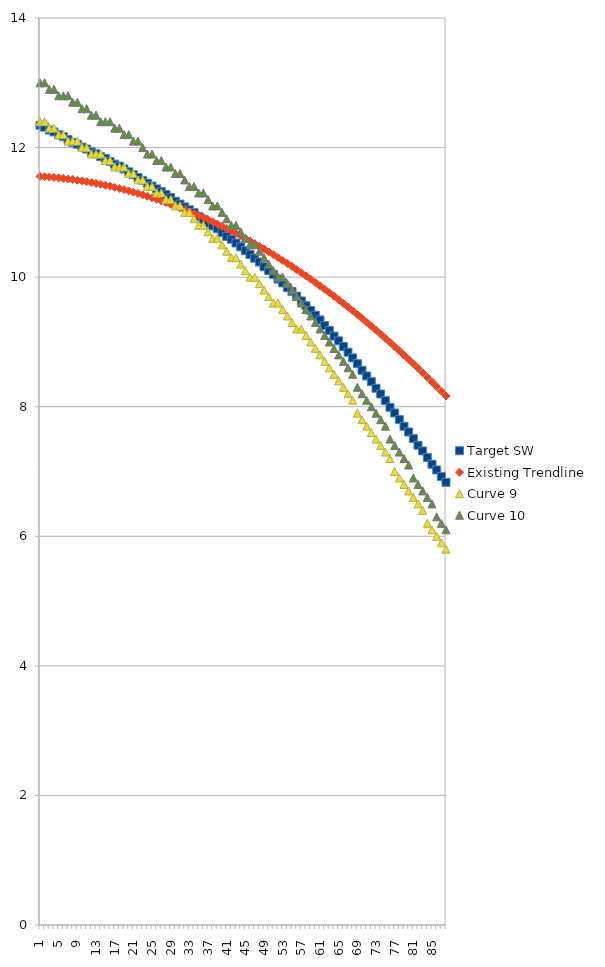
| Category | Target SW | Existing Trendline | Curve 9 | Curve 10 |
|---|---|---|---|---|
| 1 | 12.344 | 11.555 | 12.4 | 13 |
| 2 | 12.315 | 11.551 | 12.4 | 13 |
| 3 | 12.271 | 11.545 | 12.3 | 12.9 |
| 4 | 12.241 | 11.539 | 12.3 | 12.9 |
| 5 | 12.197 | 11.532 | 12.2 | 12.8 |
| 6 | 12.168 | 11.524 | 12.2 | 12.8 |
| 7 | 12.124 | 11.516 | 12.1 | 12.8 |
| 8 | 12.08 | 11.507 | 12.1 | 12.7 |
| 9 | 12.051 | 11.496 | 12.1 | 12.7 |
| 10 | 12.007 | 11.485 | 12 | 12.6 |
| 11 | 11.978 | 11.474 | 12 | 12.6 |
| 12 | 11.934 | 11.461 | 11.9 | 12.5 |
| 13 | 11.904 | 11.448 | 11.9 | 12.5 |
| 14 | 11.86 | 11.434 | 11.9 | 12.4 |
| 15 | 11.831 | 11.419 | 11.8 | 12.4 |
| 16 | 11.787 | 11.403 | 11.8 | 12.4 |
| 17 | 11.743 | 11.386 | 11.7 | 12.3 |
| 18 | 11.714 | 11.369 | 11.7 | 12.3 |
| 19 | 11.67 | 11.351 | 11.7 | 12.2 |
| 20 | 11.626 | 11.332 | 11.6 | 12.2 |
| 21 | 11.582 | 11.312 | 11.6 | 12.1 |
| 22 | 11.538 | 11.292 | 11.5 | 12.1 |
| 23 | 11.494 | 11.27 | 11.5 | 12 |
| 24 | 11.45 | 11.248 | 11.4 | 11.9 |
| 25 | 11.406 | 11.225 | 11.4 | 11.9 |
| 26 | 11.362 | 11.201 | 11.3 | 11.8 |
| 27 | 11.318 | 11.177 | 11.3 | 11.8 |
| 28 | 11.274 | 11.151 | 11.2 | 11.7 |
| 29 | 11.23 | 11.125 | 11.2 | 11.7 |
| 30 | 11.172 | 11.098 | 11.1 | 11.6 |
| 31 | 11.128 | 11.071 | 11.1 | 11.6 |
| 32 | 11.084 | 11.042 | 11 | 11.5 |
| 33 | 11.04 | 11.013 | 11 | 11.4 |
| 34 | 10.996 | 10.983 | 10.9 | 11.4 |
| 35 | 10.937 | 10.952 | 10.8 | 11.3 |
| 36 | 10.893 | 10.92 | 10.8 | 11.3 |
| 37 | 10.834 | 10.887 | 10.7 | 11.2 |
| 38 | 10.791 | 10.854 | 10.6 | 11.1 |
| 39 | 10.747 | 10.82 | 10.6 | 11.1 |
| 40 | 10.688 | 10.785 | 10.5 | 11 |
| 41 | 10.629 | 10.749 | 10.4 | 10.9 |
| 42 | 10.585 | 10.712 | 10.3 | 10.8 |
| 43 | 10.527 | 10.675 | 10.3 | 10.8 |
| 44 | 10.468 | 10.637 | 10.2 | 10.7 |
| 45 | 10.409 | 10.598 | 10.1 | 10.6 |
| 46 | 10.351 | 10.558 | 10 | 10.5 |
| 47 | 10.292 | 10.518 | 10 | 10.5 |
| 48 | 10.234 | 10.476 | 9.9 | 10.4 |
| 49 | 10.16 | 10.434 | 9.8 | 10.3 |
| 50 | 10.102 | 10.391 | 9.7 | 10.2 |
| 51 | 10.043 | 10.347 | 9.6 | 10.1 |
| 52 | 9.97 | 10.303 | 9.6 | 10 |
| 53 | 9.911 | 10.257 | 9.5 | 10 |
| 54 | 9.838 | 10.211 | 9.4 | 9.9 |
| 55 | 9.779 | 10.164 | 9.3 | 9.8 |
| 56 | 9.706 | 10.117 | 9.2 | 9.7 |
| 57 | 9.633 | 10.068 | 9.2 | 9.6 |
| 58 | 9.559 | 10.019 | 9.1 | 9.5 |
| 59 | 9.486 | 9.968 | 9 | 9.4 |
| 60 | 9.413 | 9.918 | 8.9 | 9.3 |
| 61 | 9.34 | 9.866 | 8.8 | 9.2 |
| 62 | 9.252 | 9.813 | 8.7 | 9.1 |
| 63 | 9.178 | 9.76 | 8.6 | 9 |
| 64 | 9.091 | 9.706 | 8.5 | 8.9 |
| 65 | 9.017 | 9.651 | 8.4 | 8.8 |
| 66 | 8.929 | 9.595 | 8.3 | 8.7 |
| 67 | 8.841 | 9.538 | 8.2 | 8.6 |
| 68 | 8.753 | 9.481 | 8.1 | 8.5 |
| 69 | 8.666 | 9.423 | 7.9 | 8.3 |
| 70 | 8.563 | 9.364 | 7.8 | 8.2 |
| 71 | 8.475 | 9.304 | 7.7 | 8.1 |
| 72 | 8.387 | 9.244 | 7.6 | 8 |
| 73 | 8.284 | 9.182 | 7.5 | 7.9 |
| 74 | 8.197 | 9.12 | 7.4 | 7.8 |
| 75 | 8.094 | 9.057 | 7.3 | 7.7 |
| 76 | 7.991 | 8.993 | 7.2 | 7.5 |
| 77 | 7.903 | 8.929 | 7 | 7.4 |
| 78 | 7.801 | 8.863 | 6.9 | 7.3 |
| 79 | 7.698 | 8.797 | 6.8 | 7.2 |
| 80 | 7.61 | 8.73 | 6.7 | 7.1 |
| 81 | 7.508 | 8.662 | 6.6 | 6.9 |
| 82 | 7.405 | 8.594 | 6.5 | 6.8 |
| 83 | 7.317 | 8.524 | 6.4 | 6.7 |
| 84 | 7.215 | 8.454 | 6.2 | 6.6 |
| 85 | 7.112 | 8.383 | 6.1 | 6.5 |
| 86 | 7.024 | 8.311 | 6 | 6.3 |
| 87 | 6.922 | 8.239 | 5.9 | 6.2 |
| 88 | 6.834 | 8.166 | 5.8 | 6.1 |